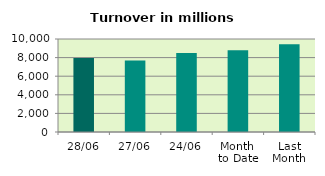
| Category | Series 0 |
|---|---|
| 28/06 | 7964.169 |
| 27/06 | 7700.027 |
| 24/06 | 8485.835 |
| Month 
to Date | 8778.131 |
| Last
Month | 9444.716 |